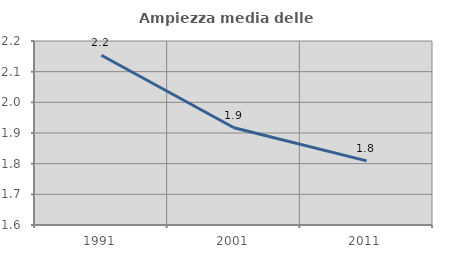
| Category | Ampiezza media delle famiglie |
|---|---|
| 1991.0 | 2.154 |
| 2001.0 | 1.917 |
| 2011.0 | 1.809 |